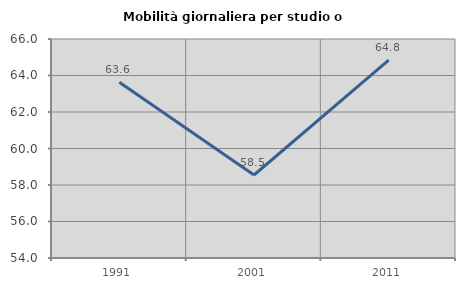
| Category | Mobilità giornaliera per studio o lavoro |
|---|---|
| 1991.0 | 63.627 |
| 2001.0 | 58.549 |
| 2011.0 | 64.846 |